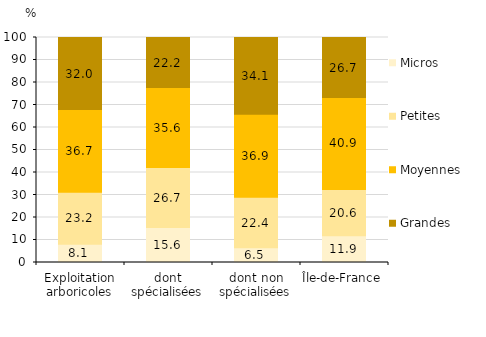
| Category | Micros | Petites | Moyennes | Grandes |
|---|---|---|---|---|
| Exploitation arboricoles | 8.108 | 23.166 | 36.68 | 32.046 |
| dont spécialisées | 15.556 | 26.667 | 35.556 | 22.222 |
| dont non spécialisées | 6.542 | 22.43 | 36.916 | 34.112 |
| Île-de-France | 11.887 | 20.588 | 40.859 | 26.667 |